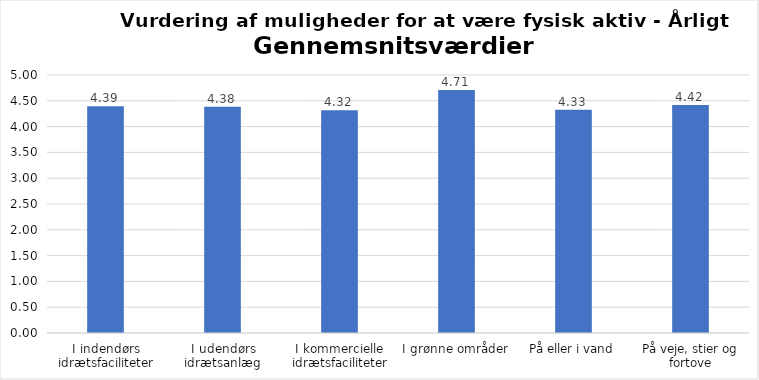
| Category | Gennemsnit |
|---|---|
| I indendørs idrætsfaciliteter | 4.393 |
| I udendørs idrætsanlæg | 4.384 |
| I kommercielle idrætsfaciliteter | 4.319 |
| I grønne områder | 4.711 |
| På eller i vand | 4.325 |
| På veje, stier og fortove | 4.418 |